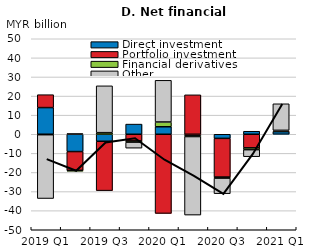
| Category | Direct investment | Portfolio investment | Financial derivatives | Other |
|---|---|---|---|---|
| 2019 Q1 | 13.96 | 6.76 | -0.237 | -33.407 |
| 2019 Q2 | -9.063 | -9.823 | -0.453 | 0.342 |
| 2019 Q3 | -3.667 | -25.841 | 0.83 | 24.525 |
| 2019 Q4 | 5.325 | -3.499 | -0.618 | -3.158 |
| 2020 Q1 | 3.919 | -41.444 | 2.501 | 21.827 |
| 2020 Q2 | -0.584 | 20.642 | -0.616 | -41.116 |
| 2020 Q3 | -2.154 | -20.274 | -0.533 | -8.15 |
| 2020 Q4 | 1.574 | -7.126 | -0.945 | -3.678 |
| 2021 Q1 | 1.386 | 0.396 | 0.265 | 13.908 |